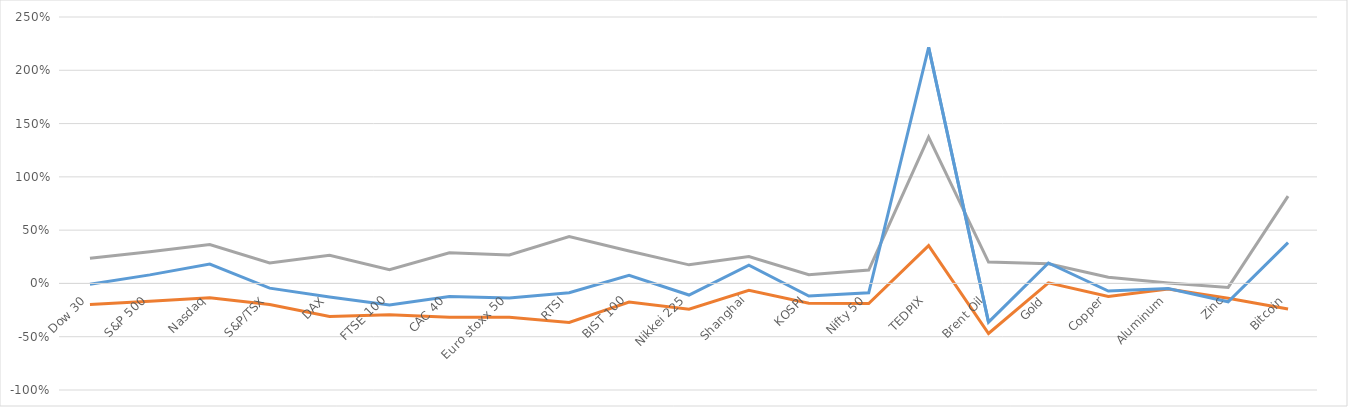
| Category | سه ماهه | یکساله | از ابتدای سال2019 تاکنون |
|---|---|---|---|
| Dow 30 | -0.197 | 0.237 | -0.007 |
| S&P 500 | -0.168 | 0.298 | 0.08 |
| Nasdaq | -0.134 | 0.364 | 0.181 |
| S&P/TSX | -0.198 | 0.192 | -0.044 |
| DAX | -0.31 | 0.265 | -0.127 |
| FTSE 100 | -0.294 | 0.129 | -0.203 |
| CAC 40 | -0.318 | 0.288 | -0.122 |
| Euro stoxx 50 | -0.318 | 0.267 | -0.136 |
| RTSI | -0.366 | 0.44 | -0.087 |
| BIST 100 | -0.175 | 0.305 | 0.076 |
| Nikkei 225 | -0.241 | 0.174 | -0.109 |
| Shanghai | -0.064 | 0.252 | 0.171 |
| KOSPI | -0.186 | 0.082 | -0.119 |
| Nifty 50 | -0.189 | 0.126 | -0.088 |
| TEDPIX | 0.354 | 1.373 | 2.214 |
| Brent Oil | -0.47 | 0.2 | -0.364 |
| Gold | 0.006 | 0.185 | 0.192 |
| Copper | -0.122 | 0.058 | -0.071 |
| Aluminum | -0.052 | 0.005 | -0.048 |
| Zinc | -0.14 | -0.038 | -0.172 |
| Bitcoin | -0.24 | 0.82 | 0.383 |